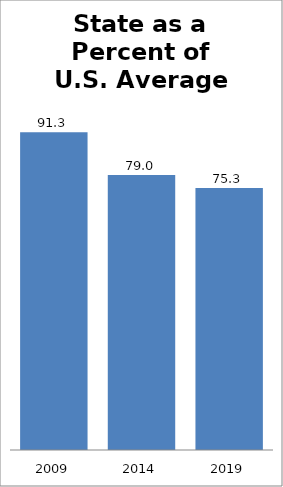
| Category | Series 0 |
|---|---|
| 2009.0 | 91.273 |
| 2014.0 | 79.032 |
| 2019.0 | 75.262 |